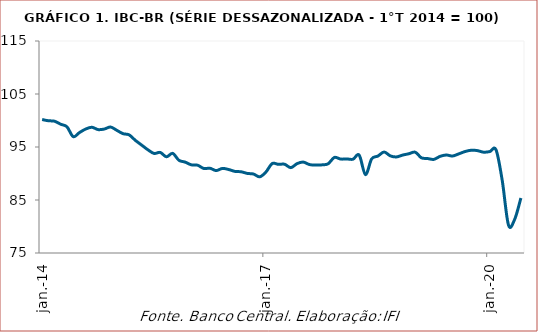
| Category | IBC-BR |
|---|---|
| 2014-01-01 | 100.182 |
| 2014-02-01 | 99.953 |
| 2014-03-01 | 99.865 |
| 2014-04-01 | 99.291 |
| 2014-05-01 | 98.804 |
| 2014-06-01 | 96.953 |
| 2014-07-01 | 97.717 |
| 2014-08-01 | 98.385 |
| 2014-09-01 | 98.723 |
| 2014-10-01 | 98.284 |
| 2014-11-01 | 98.385 |
| 2014-12-01 | 98.771 |
| 2015-01-01 | 98.156 |
| 2015-02-01 | 97.521 |
| 2015-03-01 | 97.284 |
| 2015-04-01 | 96.251 |
| 2015-05-01 | 95.366 |
| 2015-06-01 | 94.488 |
| 2015-07-01 | 93.785 |
| 2015-08-01 | 93.974 |
| 2015-09-01 | 93.15 |
| 2015-10-01 | 93.799 |
| 2015-11-01 | 92.495 |
| 2015-12-01 | 92.15 |
| 2016-01-01 | 91.637 |
| 2016-02-01 | 91.569 |
| 2016-03-01 | 90.948 |
| 2016-04-01 | 90.988 |
| 2016-05-01 | 90.549 |
| 2016-06-01 | 90.961 |
| 2016-07-01 | 90.752 |
| 2016-08-01 | 90.401 |
| 2016-09-01 | 90.326 |
| 2016-10-01 | 90.016 |
| 2016-11-01 | 89.901 |
| 2016-12-01 | 89.374 |
| 2017-01-01 | 90.286 |
| 2017-02-01 | 91.867 |
| 2017-03-01 | 91.725 |
| 2017-04-01 | 91.745 |
| 2017-05-01 | 91.103 |
| 2017-06-01 | 91.86 |
| 2017-07-01 | 92.15 |
| 2017-08-01 | 91.684 |
| 2017-09-01 | 91.59 |
| 2017-10-01 | 91.63 |
| 2017-11-01 | 91.833 |
| 2017-12-01 | 93.028 |
| 2018-01-01 | 92.724 |
| 2018-02-01 | 92.745 |
| 2018-03-01 | 92.697 |
| 2018-04-01 | 93.454 |
| 2018-05-01 | 89.786 |
| 2018-06-01 | 92.751 |
| 2018-07-01 | 93.285 |
| 2018-08-01 | 94.055 |
| 2018-09-01 | 93.326 |
| 2018-10-01 | 93.13 |
| 2018-11-01 | 93.481 |
| 2018-12-01 | 93.731 |
| 2019-01-01 | 94.021 |
| 2019-02-01 | 92.961 |
| 2019-03-01 | 92.826 |
| 2019-04-01 | 92.664 |
| 2019-05-01 | 93.231 |
| 2019-06-01 | 93.488 |
| 2019-07-01 | 93.299 |
| 2019-08-01 | 93.697 |
| 2019-09-01 | 94.136 |
| 2019-10-01 | 94.386 |
| 2019-11-01 | 94.319 |
| 2019-12-01 | 94.021 |
| 2020-01-01 | 94.136 |
| 2020-02-01 | 94.467 |
| 2020-03-01 | 88.671 |
| 2020-04-01 | 80.295 |
| 2020-05-01 | 81.348 |
| 2020-06-01 | 85.375 |